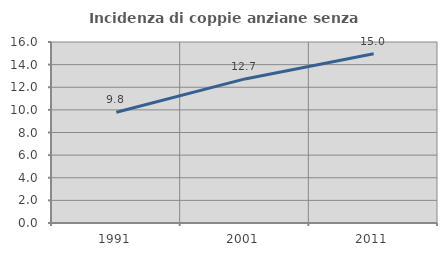
| Category | Incidenza di coppie anziane senza figli  |
|---|---|
| 1991.0 | 9.787 |
| 2001.0 | 12.737 |
| 2011.0 | 14.97 |